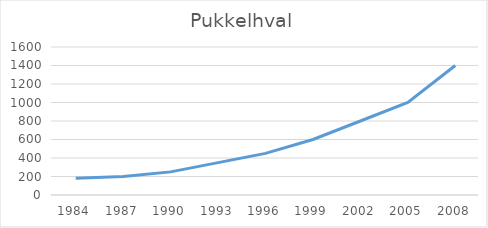
| Category | Series 0 |
|---|---|
| 1984.0 | 180 |
| 1987.0 | 200 |
| 1990.0 | 250 |
| 1993.0 | 350 |
| 1996.0 | 450 |
| 1999.0 | 600 |
| 2002.0 | 800 |
| 2005.0 | 1000 |
| 2008.0 | 1400 |